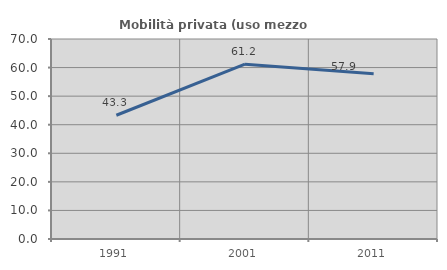
| Category | Mobilità privata (uso mezzo privato) |
|---|---|
| 1991.0 | 43.312 |
| 2001.0 | 61.17 |
| 2011.0 | 57.857 |